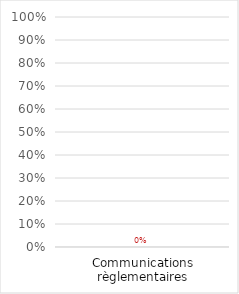
| Category | Series 0 |
|---|---|
| Communications règlementaires | 0 |